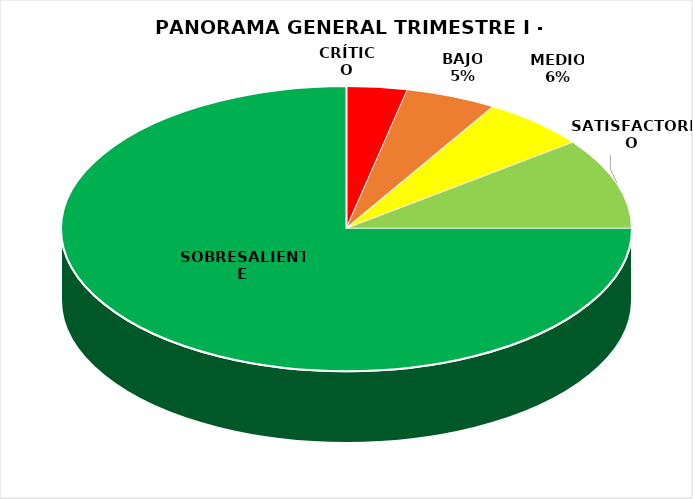
| Category | Series 0 |
|---|---|
| CRÍTICO | 4 |
| BAJO | 6 |
| MEDIO | 7 |
| SATISFACTORIO | 12 |
| SOBRESALIENTE | 87 |